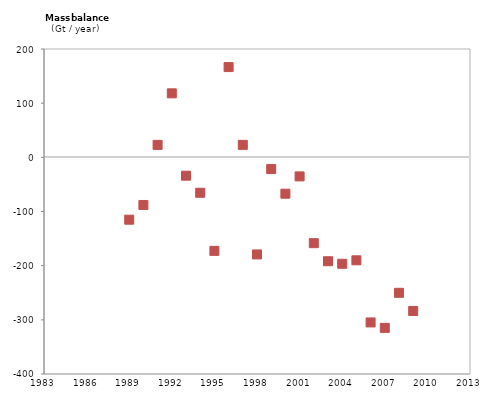
| Category | MB(Gt yr-1) |
|---|---|
| 1989.0 | -115.11 |
| 1990.0 | -87.969 |
| 1991.0 | 22.975 |
| 1992.0 | 118.15 |
| 1993.0 | -33.887 |
| 1994.0 | -65.43 |
| 1995.0 | -172.71 |
| 1996.0 | 166.6 |
| 1997.0 | 23.001 |
| 1998.0 | -179.26 |
| 1999.0 | -21.703 |
| 2000.0 | -67.127 |
| 2001.0 | -35.205 |
| 2002.0 | -158.45 |
| 2003.0 | -191.84 |
| 2004.0 | -196.54 |
| 2005.0 | -190.11 |
| 2006.0 | -304.83 |
| 2007.0 | -314.84 |
| 2008.0 | -250.12 |
| 2009.0 | -283.64 |